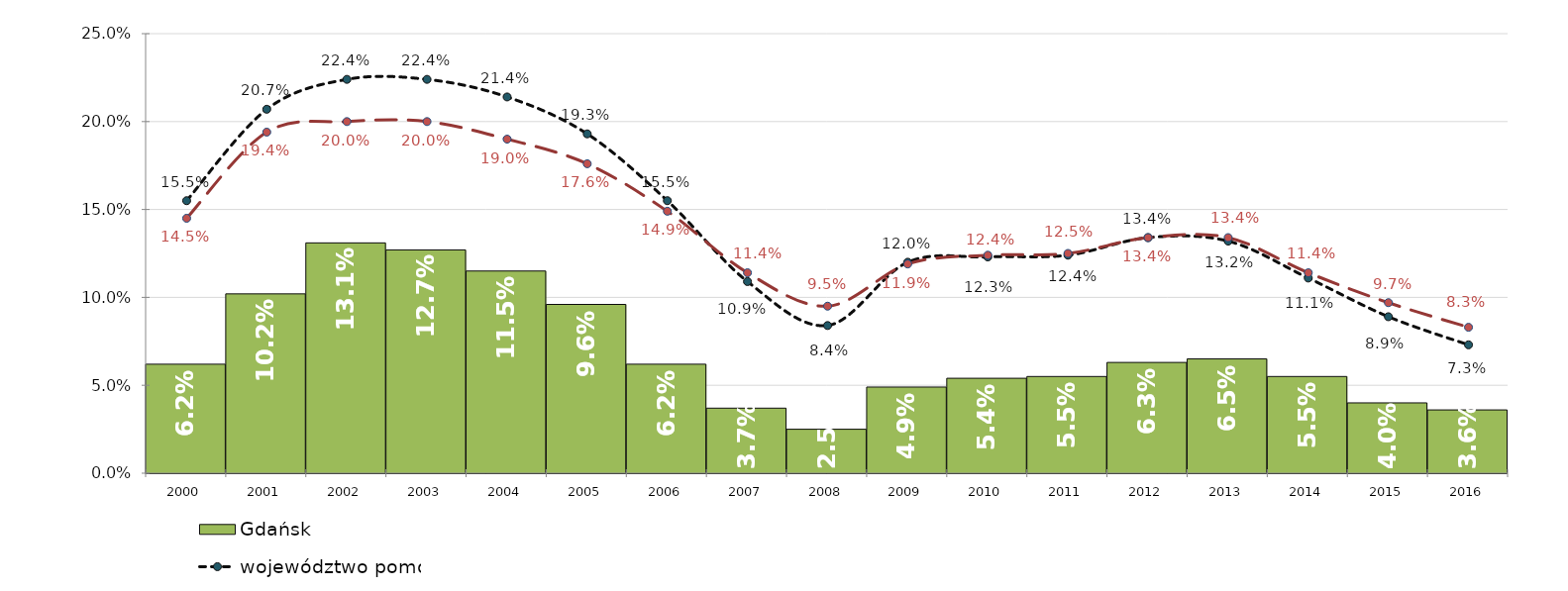
| Category | Gdańsk |
|---|---|
| 2000.0 | 0.062 |
| 2001.0 | 0.102 |
| 2002.0 | 0.131 |
| 2003.0 | 0.127 |
| 2004.0 | 0.115 |
| 2005.0 | 0.096 |
| 2006.0 | 0.062 |
| 2007.0 | 0.037 |
| 2008.0 | 0.025 |
| 2009.0 | 0.049 |
| 2010.0 | 0.054 |
| 2011.0 | 0.055 |
| 2012.0 | 0.063 |
| 2013.0 | 0.065 |
| 2014.0 | 0.055 |
| 2015.0 | 0.04 |
| 2016.0 | 0.036 |